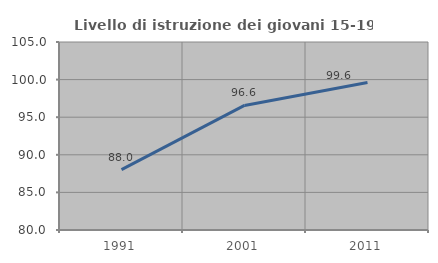
| Category | Livello di istruzione dei giovani 15-19 anni |
|---|---|
| 1991.0 | 88.034 |
| 2001.0 | 96.565 |
| 2011.0 | 99.614 |